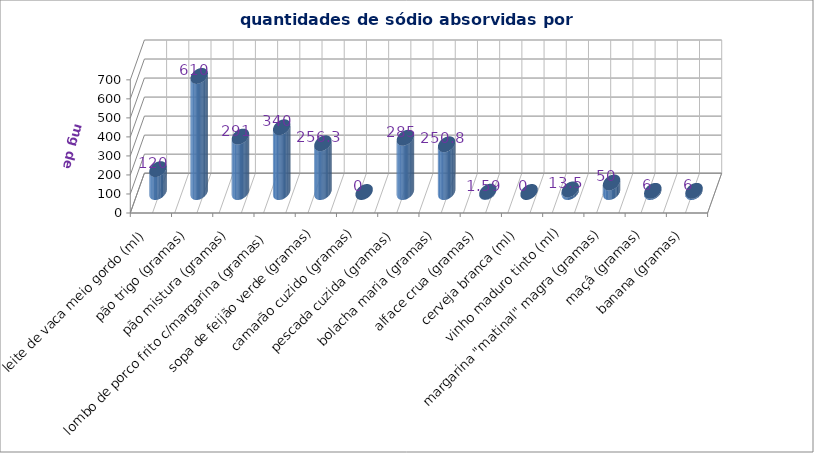
| Category | Series 0 |
|---|---|
| leite de vaca meio gordo (ml) | 120 |
| pão trigo (gramas) | 610 |
| pão mistura (gramas) | 291 |
| lombo de porco frito c/margarina (gramas) | 340 |
| sopa de feijão verde (gramas) | 256.3 |
| camarão cuzido (gramas) | 0 |
| pescada cuzida (gramas) | 285 |
| bolacha maria (gramas) | 250.8 |
| alface crua (gramas) | 1.59 |
| cerveja branca (ml) | 0 |
| vinho maduro tinto (ml) | 13.5 |
| margarina "matinal" magra (gramas) | 50 |
| maçâ (gramas) | 6 |
| banana (gramas) | 6 |